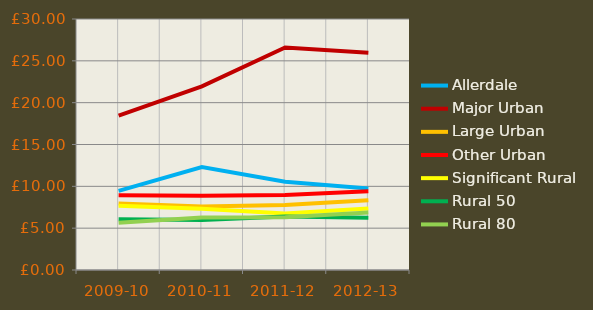
| Category | Allerdale | Major Urban | Large Urban | Other Urban | Significant Rural | Rural 50 | Rural 80 |
|---|---|---|---|---|---|---|---|
| 2009-10 | 9.45 | 18.451 | 7.933 | 8.948 | 7.69 | 6.08 | 5.642 |
| 2010-11 | 12.305 | 21.955 | 7.584 | 8.88 | 7.31 | 5.987 | 6.27 |
| 2011-12 | 10.55 | 26.587 | 7.783 | 8.965 | 6.741 | 6.396 | 6.299 |
| 2012-13 | 9.751 | 25.969 | 8.333 | 9.427 | 7.358 | 6.231 | 6.871 |